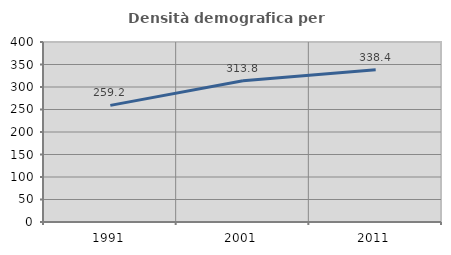
| Category | Densità demografica |
|---|---|
| 1991.0 | 259.18 |
| 2001.0 | 313.803 |
| 2011.0 | 338.439 |